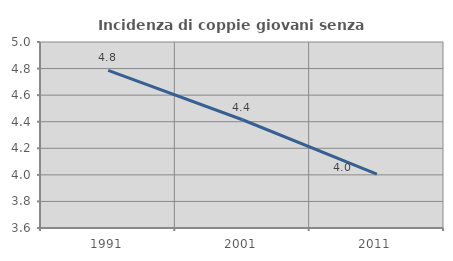
| Category | Incidenza di coppie giovani senza figli |
|---|---|
| 1991.0 | 4.787 |
| 2001.0 | 4.415 |
| 2011.0 | 4.006 |